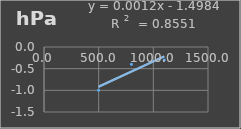
| Category | Presión Atmosférica |
|---|---|
| 499.0 | -1 |
| 799.8 | -0.4 |
| 1099.9 | -0.3 |